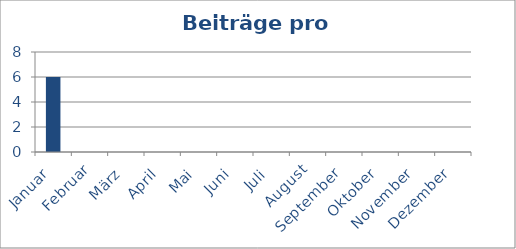
| Category | Beiträge |
|---|---|
| Januar | 6 |
| Februar | 0 |
| März | 0 |
| April | 0 |
| Mai | 0 |
| Juni | 0 |
| Juli | 0 |
| August | 0 |
| September | 0 |
| Oktober | 0 |
| November | 0 |
| Dezember | 0 |